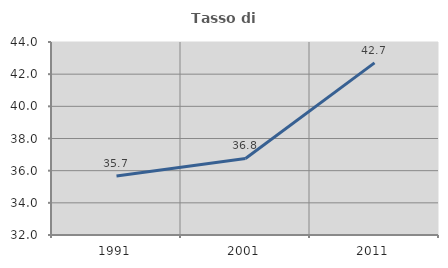
| Category | Tasso di occupazione   |
|---|---|
| 1991.0 | 35.667 |
| 2001.0 | 36.758 |
| 2011.0 | 42.702 |